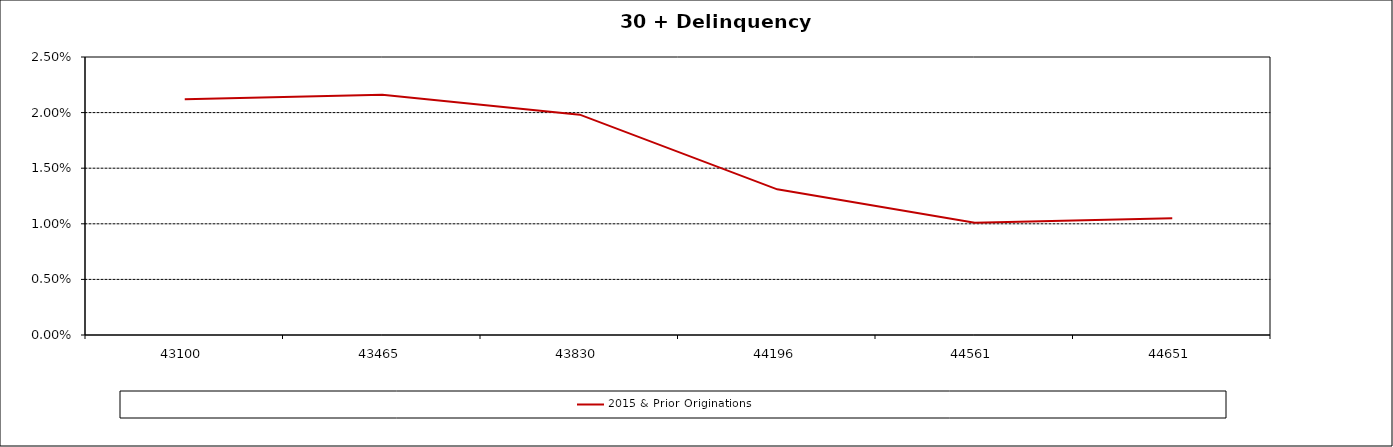
| Category | 2015 & Prior Originations |
|---|---|
| 2017-12-31 | 0.021 |
| 2018-12-31 | 0.022 |
| 2019-12-31 | 0.02 |
| 2020-12-31 | 0.013 |
| 2021-12-31 | 0.01 |
| 2022-03-31 | 0.01 |